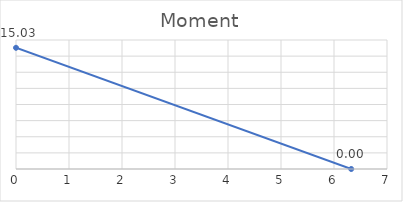
| Category | Series 0 |
|---|---|
| 0.0 | 15.034 |
| 6.324555320336759 | 0 |